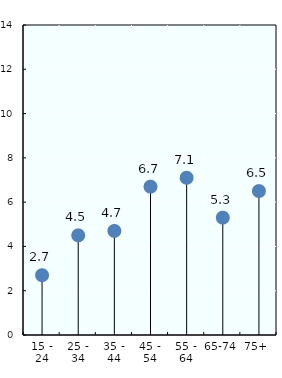
| Category | Men |
|---|---|
| 15 - 24 | 2.7 |
| 25 - 34 | 4.5 |
| 35 - 44 | 4.7 |
| 45 - 54 | 6.7 |
| 55 - 64 | 7.1 |
| 65-74 | 5.3 |
| 75+ | 6.5 |